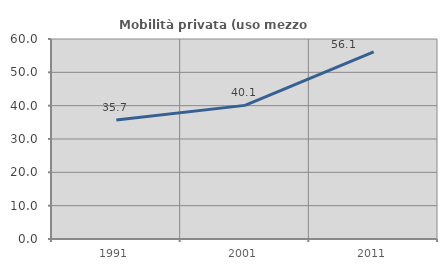
| Category | Mobilità privata (uso mezzo privato) |
|---|---|
| 1991.0 | 35.683 |
| 2001.0 | 40.086 |
| 2011.0 | 56.118 |